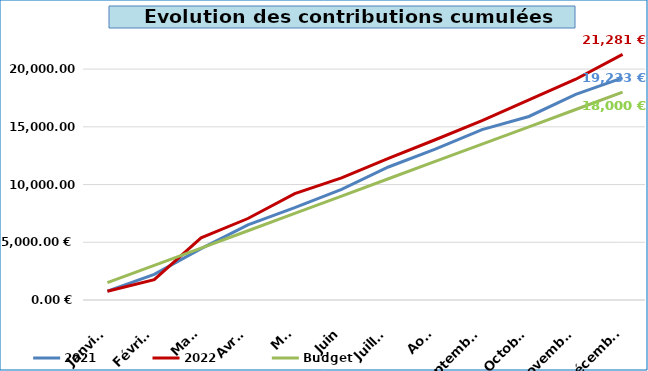
| Category | 2021 | 2022 | Budget |
|---|---|---|---|
| Janvier | 765 | 758.92 | 1500 |
| Février | 2216.19 | 1768.24 | 3000 |
| Mars | 4449.71 | 5387.38 | 4500 |
| Avril | 6512.23 | 7057.92 | 6000 |
| Mai | 7997.51 | 9208.56 | 7500 |
| Juin | 9585.8 | 10573.79 | 9000 |
| Juillet | 11521.71 | 12269.88 | 10500 |
| Août | 13060.62 | 13879.53 | 12000 |
| Septembre | 14759.91 | 15531.1 | 13500 |
| Octobre | 15895.29 | 17334.51 | 15000 |
| Novembre | 17808.45 | 19121.41 | 16500 |
| Décembre | 19233.2 | 21280.66 | 18000 |